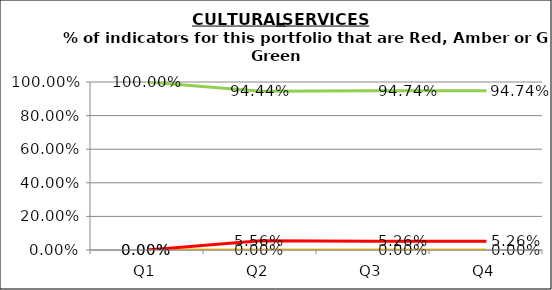
| Category | Green | Amber | Red |
|---|---|---|---|
| Q1 | 1 | 0 | 0 |
| Q2 | 0.944 | 0 | 0.056 |
| Q3 | 0.947 | 0 | 0.053 |
| Q4 | 0.947 | 0 | 0.053 |